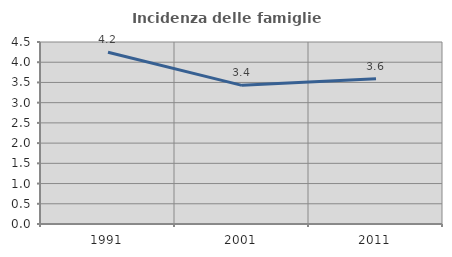
| Category | Incidenza delle famiglie numerose |
|---|---|
| 1991.0 | 4.247 |
| 2001.0 | 3.429 |
| 2011.0 | 3.591 |